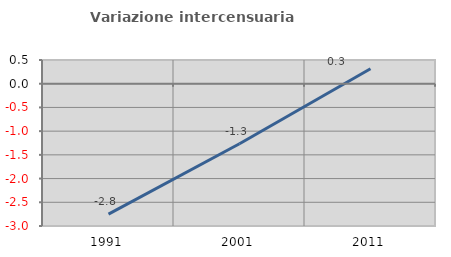
| Category | Variazione intercensuaria annua |
|---|---|
| 1991.0 | -2.751 |
| 2001.0 | -1.265 |
| 2011.0 | 0.316 |